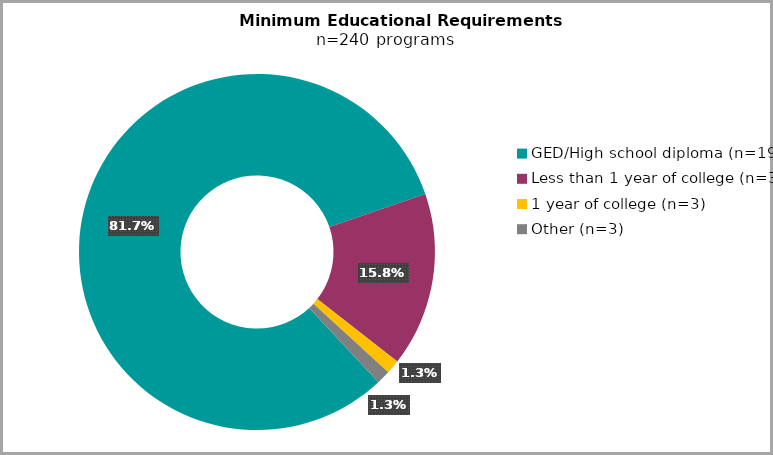
| Category | Series 0 |
|---|---|
| GED/High school diploma (n=196) | 0.817 |
| Less than 1 year of college (n=38) | 0.158 |
| 1 year of college (n=3) | 0.012 |
| Other (n=3) | 0.012 |